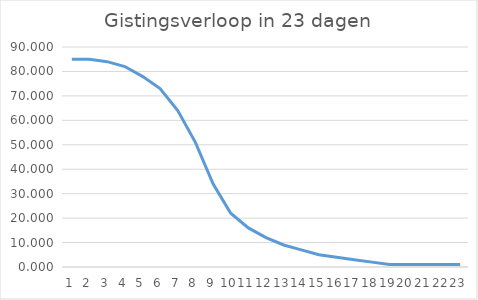
| Category | Series 0 |
|---|---|
| 0 | 85 |
| 1 | 85 |
| 2 | 84 |
| 3 | 82 |
| 4 | 78 |
| 5 | 73 |
| 6 | 64 |
| 7 | 51 |
| 8 | 34 |
| 9 | 22 |
| 10 | 16 |
| 11 | 12 |
| 12 | 9 |
| 13 | 7 |
| 14 | 5 |
| 15 | 4 |
| 16 | 3 |
| 17 | 2 |
| 18 | 1 |
| 19 | 0.999 |
| 20 | 0.998 |
| 21 | 0.997 |
| 22 | 0.997 |